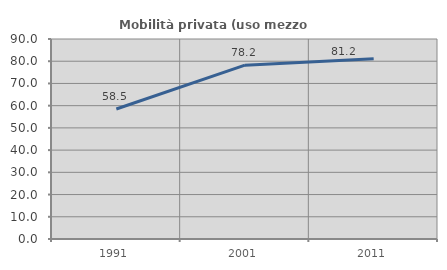
| Category | Mobilità privata (uso mezzo privato) |
|---|---|
| 1991.0 | 58.512 |
| 2001.0 | 78.228 |
| 2011.0 | 81.159 |